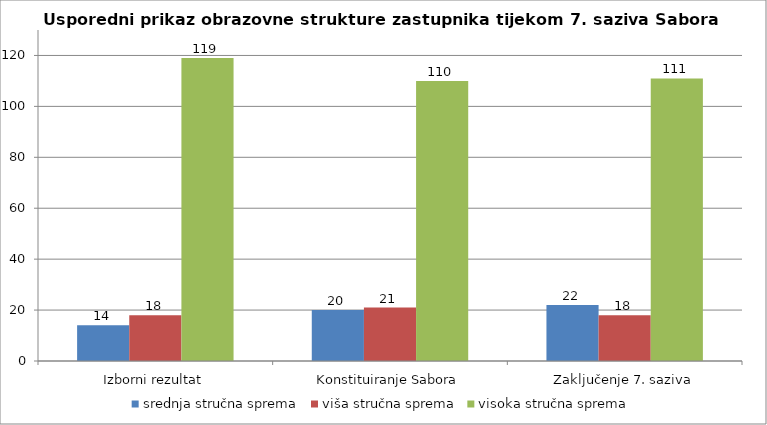
| Category | srednja stručna sprema | viša stručna sprema | visoka stručna sprema |
|---|---|---|---|
| Izborni rezultat | 14 | 18 | 119 |
| Konstituiranje Sabora | 20 | 21 | 110 |
| Zaključenje 7. saziva | 22 | 18 | 111 |